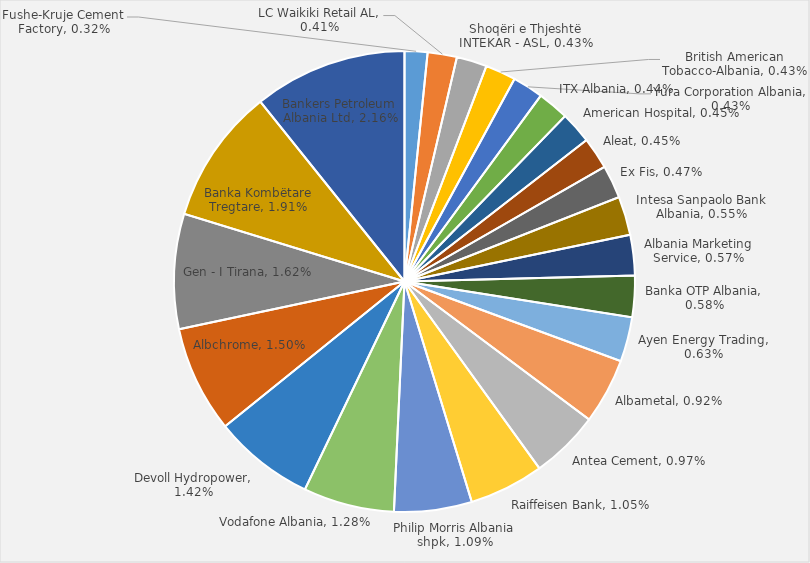
| Category | Share by Total Turnover of 100 Big Companies |
|---|---|
| Fushe-Kruje Cement Factory | 0.003 |
| LC Waikiki Retail AL | 0.004 |
| Shoqëri e Thjeshtë INTEKAR - ASL | 0.004 |
| British American Tobacco-Albania | 0.004 |
| Yura Corporation Albania | 0.004 |
| ITX Albania | 0.004 |
| American Hospital | 0.004 |
| Aleat | 0.004 |
| Ex Fis | 0.005 |
| Intesa Sanpaolo Bank Albania | 0.005 |
| Albania Marketing Service | 0.006 |
| Banka OTP Albania | 0.006 |
| Ayen Energy Trading | 0.006 |
| Albametal | 0.009 |
| Antea Cement | 0.01 |
| Raiffeisen Bank | 0.011 |
| Philip Morris Albania shpk | 0.011 |
| Vodafone Albania | 0.013 |
| Devoll Hydropower | 0.014 |
| Albchrome | 0.015 |
| Gen - I Tirana | 0.016 |
| Banka Kombëtare Tregtare | 0.019 |
| Bankers Petroleum Albania Ltd | 0.022 |